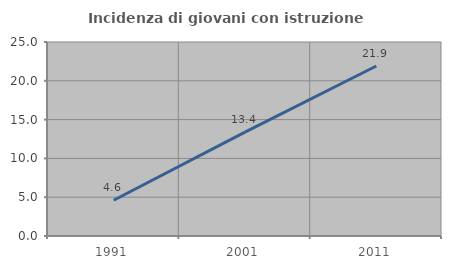
| Category | Incidenza di giovani con istruzione universitaria |
|---|---|
| 1991.0 | 4.612 |
| 2001.0 | 13.391 |
| 2011.0 | 21.91 |